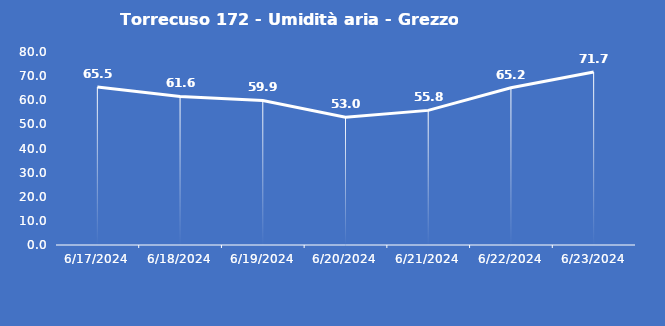
| Category | Torrecuso 172 - Umidità aria - Grezzo (%) |
|---|---|
| 6/17/24 | 65.5 |
| 6/18/24 | 61.6 |
| 6/19/24 | 59.9 |
| 6/20/24 | 53 |
| 6/21/24 | 55.8 |
| 6/22/24 | 65.2 |
| 6/23/24 | 71.7 |